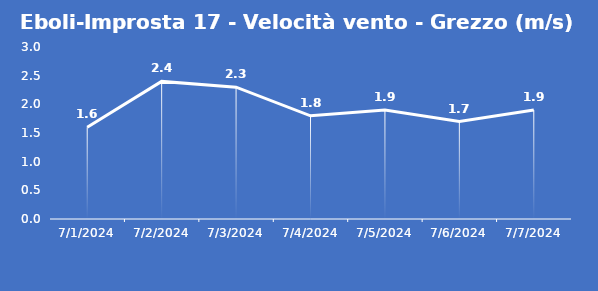
| Category | Eboli-Improsta 17 - Velocità vento - Grezzo (m/s) |
|---|---|
| 7/1/24 | 1.6 |
| 7/2/24 | 2.4 |
| 7/3/24 | 2.3 |
| 7/4/24 | 1.8 |
| 7/5/24 | 1.9 |
| 7/6/24 | 1.7 |
| 7/7/24 | 1.9 |